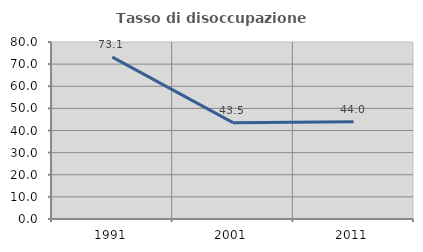
| Category | Tasso di disoccupazione giovanile  |
|---|---|
| 1991.0 | 73.148 |
| 2001.0 | 43.529 |
| 2011.0 | 44 |